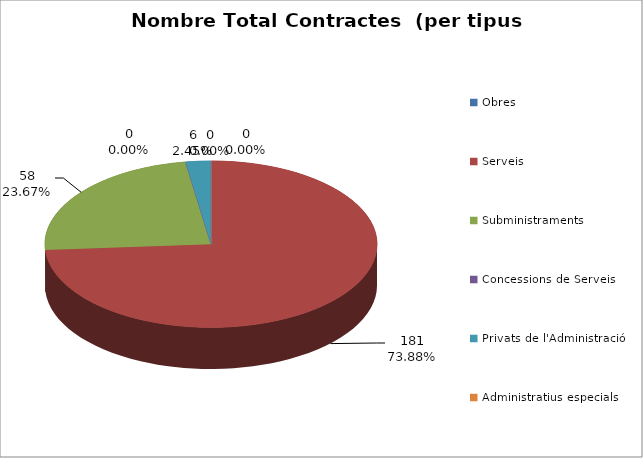
| Category | Nombre Total Contractes |
|---|---|
| Obres | 0 |
| Serveis | 181 |
| Subministraments | 58 |
| Concessions de Serveis | 0 |
| Privats de l'Administració | 6 |
| Administratius especials | 0 |